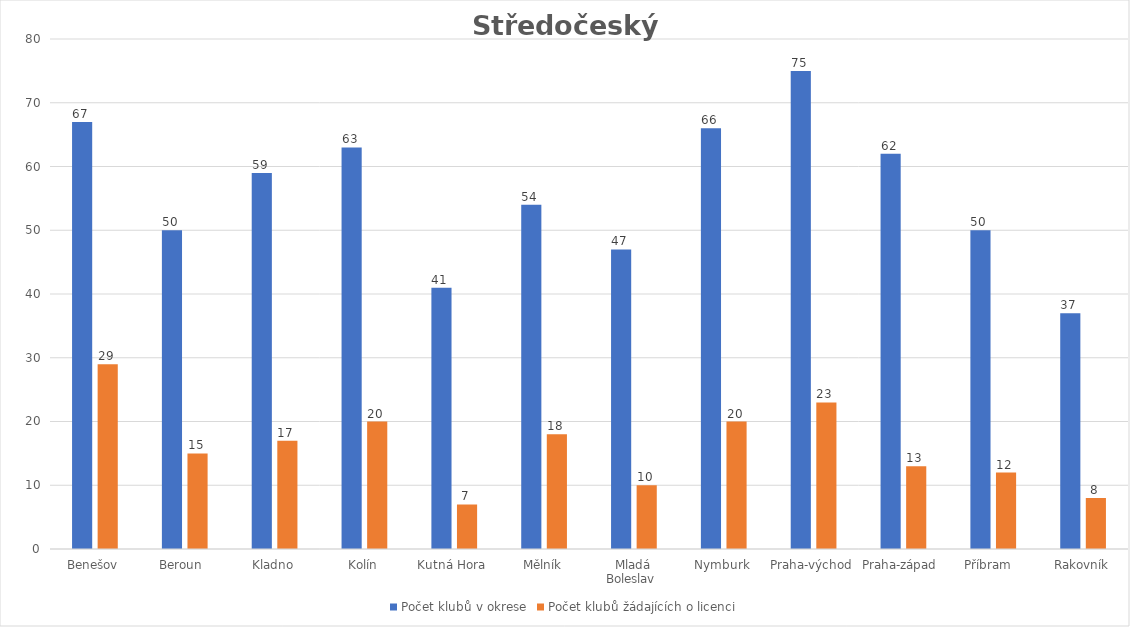
| Category | Počet klubů v okrese | Počet klubů žádajících o licenci |
|---|---|---|
| Benešov | 67 | 29 |
| Beroun  | 50 | 15 |
| Kladno | 59 | 17 |
| Kolín | 63 | 20 |
| Kutná Hora  | 41 | 7 |
| Mělník | 54 | 18 |
| Mladá Boleslav  | 47 | 10 |
| Nymburk | 66 | 20 |
| Praha-východ | 75 | 23 |
| Praha-západ  | 62 | 13 |
| Příbram   | 50 | 12 |
| Rakovník | 37 | 8 |